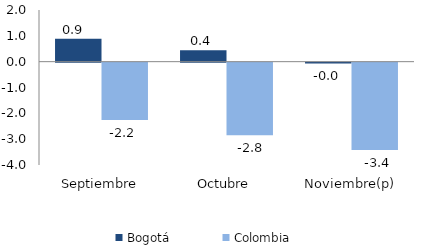
| Category | Bogotá | Colombia |
|---|---|---|
| Septiembre | 0.887 | -2.223 |
| Octubre | 0.442 | -2.807 |
| Noviembre(p) | -0.031 | -3.382 |